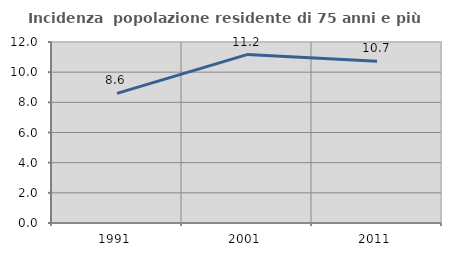
| Category | Incidenza  popolazione residente di 75 anni e più |
|---|---|
| 1991.0 | 8.597 |
| 2001.0 | 11.166 |
| 2011.0 | 10.724 |